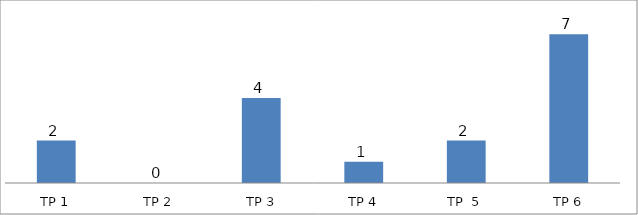
| Category | BIL. MURID |
|---|---|
| TP 1 | 2 |
| TP 2 | 0 |
|  TP 3 | 4 |
| TP 4 | 1 |
| TP  5 | 2 |
| TP 6 | 7 |